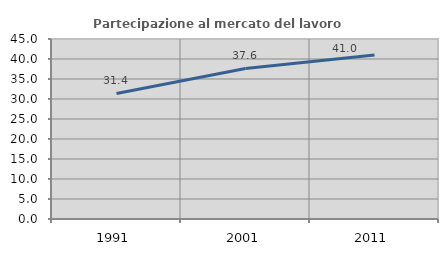
| Category | Partecipazione al mercato del lavoro  femminile |
|---|---|
| 1991.0 | 31.387 |
| 2001.0 | 37.64 |
| 2011.0 | 40.994 |